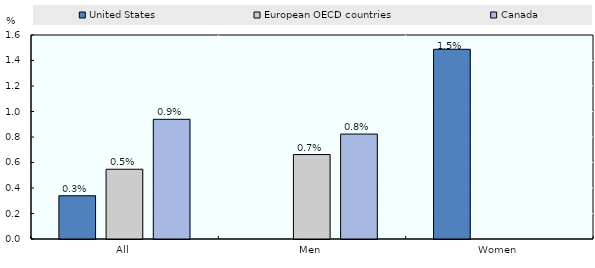
| Category | United States | European OECD countries | Canada |
|---|---|---|---|
| All | 0.339 | 0.547 | 0.939 |
| Men | 0 | 0.662 | 0.823 |
| Women | 1.488 | 0 | 0 |